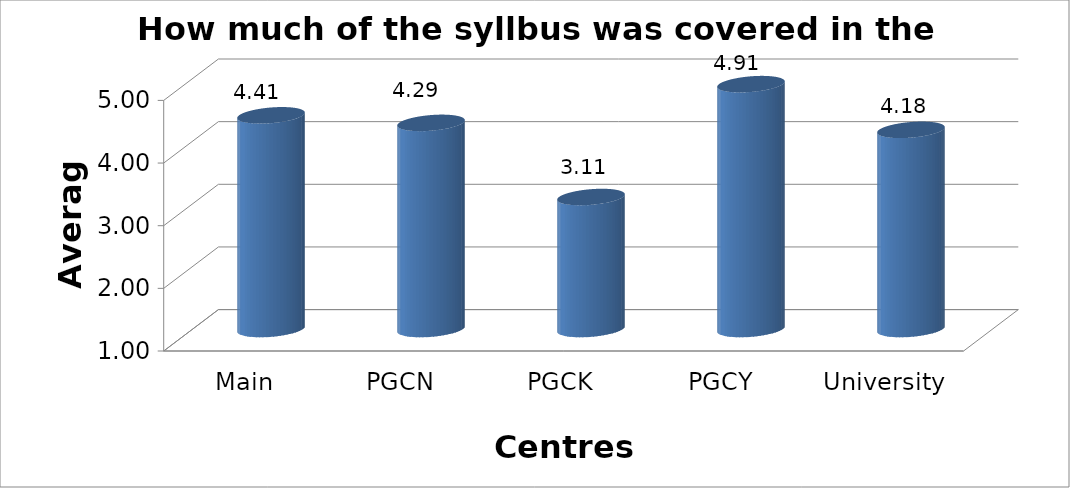
| Category | How much of the syllbus was covered in the class |
|---|---|
| Main Campus | 4.411 |
| PGCN | 4.29 |
| PGCK | 3.107 |
| PGCY | 4.908 |
| University Avg | 4.179 |